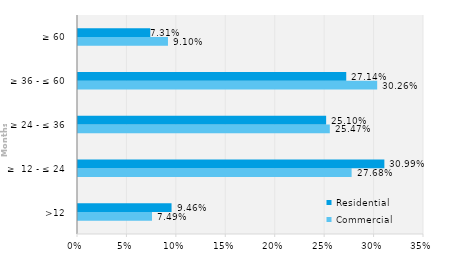
| Category | Commercial | Residential |
|---|---|---|
| >12 | 0.075 | 0.095 |
| ≥  12 - ≤ 24 | 0.277 | 0.31 |
| ≥ 24 - ≤ 36 | 0.255 | 0.251 |
| ≥ 36 - ≤ 60 | 0.303 | 0.271 |
| ≥ 60 | 0.091 | 0.073 |